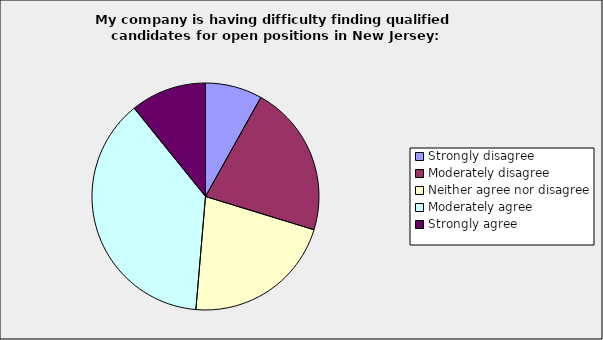
| Category | Series 0 |
|---|---|
| Strongly disagree | 0.081 |
| Moderately disagree | 0.216 |
| Neither agree nor disagree | 0.216 |
| Moderately agree | 0.378 |
| Strongly agree | 0.108 |